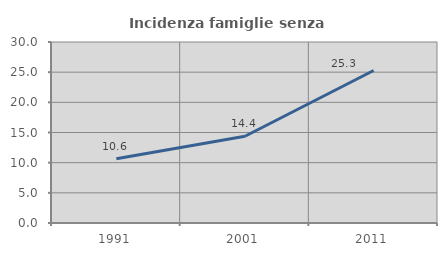
| Category | Incidenza famiglie senza nuclei |
|---|---|
| 1991.0 | 10.638 |
| 2001.0 | 14.374 |
| 2011.0 | 25.28 |